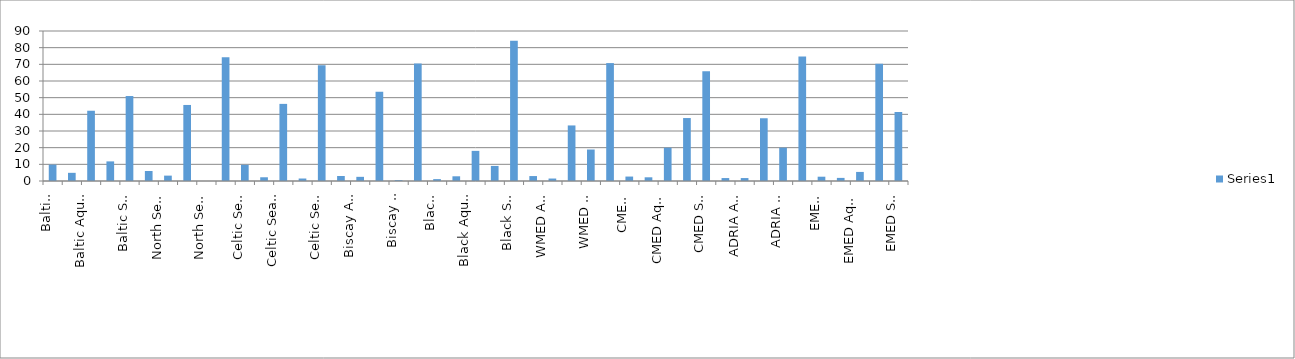
| Category | Series 0 |
|---|---|
| Baltic Other | 9.804 |
| Baltic Aquarium trade | 4.902 |
| Baltic Aquaculture | 42.157 |
| Baltic Corridor | 11.765 |
| Baltic Shipping | 50.98 |
| North Sea Other | 5.991 |
| North Sea Aquarium trade | 3.226 |
| North Sea Aquaculture | 45.622 |
| North Sea Corridor | 0 |
| North Sea Shipping | 74.194 |
| Celtic Sea Other | 9.701 |
| Celtic Sea Aquarium trade | 2.239 |
| Celtic Sea Aquaculture | 46.269 |
| Celtic Sea Corridor | 1.493 |
| Celtic Sea Shipping | 69.403 |
| Biscay Other | 3 |
| Biscay Aquarium trade | 2.5 |
| Biscay Aquaculture | 53.5 |
| Biscay Corridor | 0.5 |
| Biscay Shipping | 70.5 |
| Black Other | 1.13 |
| Black Aquarium trade | 2.825 |
| Black Aquaculture | 18.079 |
| Black Corridor | 9.04 |
| Black Shipping | 84.181 |
| WMED Other | 2.963 |
| WMED Aquarium trade | 1.481 |
| WMED Aquaculture | 33.333 |
| WMED Corridor | 18.889 |
| WMED Shipping | 70.741 |
| CMED Other | 2.667 |
| CMED Aquarium trade | 2.222 |
| CMED Aquaculture | 20 |
| CMED Corridor | 37.778 |
| CMED Shipping | 65.778 |
| ADRIA Other | 1.765 |
| ADRIA Aquarium trade | 1.765 |
| ADRIA Aquaculture | 37.647 |
| ADRIA Corridor | 20 |
| ADRIA Shipping | 74.706 |
| EMED other | 2.579 |
| EMED Aquarium/trade | 1.862 |
| EMED Aquaculture | 5.444 |
| EMED corridor | 70.344 |
| EMED Shipping | 41.404 |